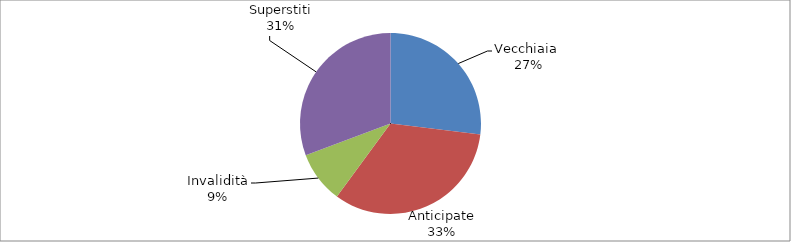
| Category | Series 0 |
|---|---|
| Vecchiaia  | 64422 |
| Anticipate | 79181 |
| Invalidità | 22044 |
| Superstiti | 73349 |